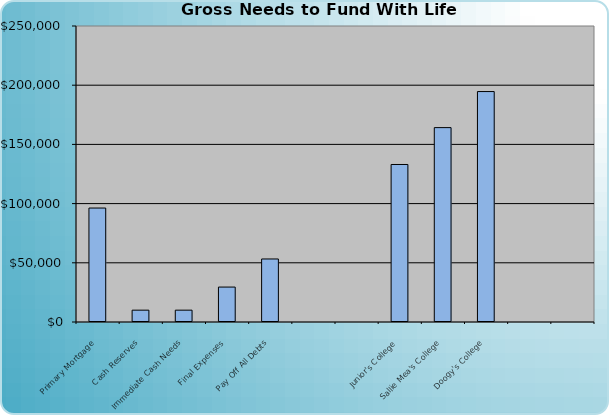
| Category | Series 0 |
|---|---|
| Primary Mortgage | 96247.428 |
| Cash Reserves | 10000 |
| Immediate Cash Needs | 10000 |
| Final Expenses | 29500 |
| Pay Off All Debts | 53228.929 |
|   | 0 |
|   | 0 |
| Junior's College | 133034.748 |
| Sallie Mea's College | 164173.041 |
| Doogy's College | 194634.575 |
|   | 0 |
|   | 0 |